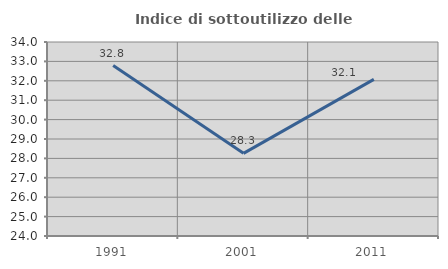
| Category | Indice di sottoutilizzo delle abitazioni  |
|---|---|
| 1991.0 | 32.787 |
| 2001.0 | 28.261 |
| 2011.0 | 32.075 |